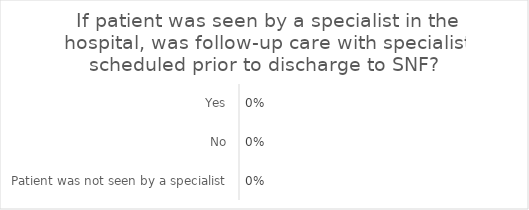
| Category | Series 0 |
|---|---|
| Yes | 0 |
| No | 0 |
| Patient was not seen by a specialist | 0 |